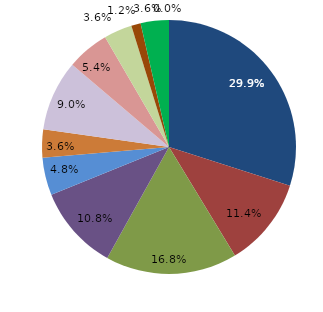
| Category | Series 0 |
|---|---|
| قبل الدخول | 29.94 |
| -1 | 11.377 |
| 1 | 16.766 |
| 2 | 10.778 |
| 3 | 4.79 |
| 4 | 3.593 |
|  5 - 9 | 8.982 |
|  10 - 14 | 5.389 |
|  15 - 19 | 3.593 |
|  20 - 24 | 1.198 |
| 25 + | 3.593 |
| غير مبين | 0 |